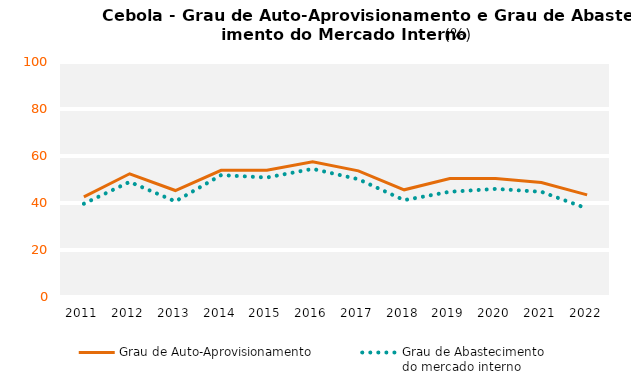
| Category | Grau de Auto-Aprovisionamento | Grau de Abastecimento
do mercado interno |
|---|---|---|
| 2011.0 | 42.621 | 39.693 |
| 2012.0 | 52.441 | 48.985 |
| 2013.0 | 45.31 | 40.687 |
| 2014.0 | 53.927 | 51.865 |
| 2015.0 | 53.918 | 50.843 |
| 2016.0 | 57.593 | 54.529 |
| 2017.0 | 53.685 | 50.115 |
| 2018.0 | 45.606 | 41.223 |
| 2019.0 | 50.428 | 44.784 |
| 2020.0 | 50.417 | 45.995 |
| 2021.0 | 48.713 | 44.766 |
| 2022.0 | 43.476 | 37.637 |